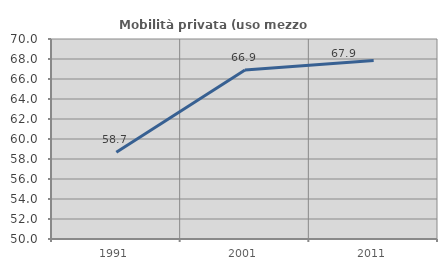
| Category | Mobilità privata (uso mezzo privato) |
|---|---|
| 1991.0 | 58.667 |
| 2001.0 | 66.906 |
| 2011.0 | 67.857 |